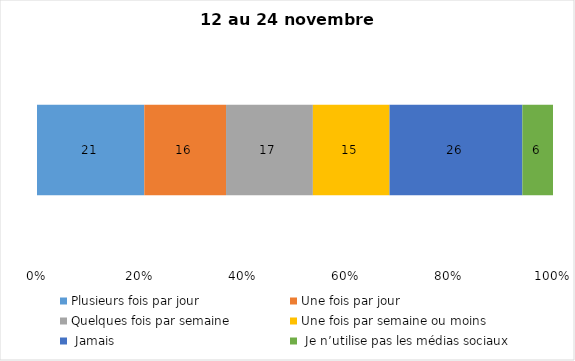
| Category | Plusieurs fois par jour | Une fois par jour | Quelques fois par semaine   | Une fois par semaine ou moins   |  Jamais   |  Je n’utilise pas les médias sociaux |
|---|---|---|---|---|---|---|
| 0 | 21 | 16 | 17 | 15 | 26 | 6 |